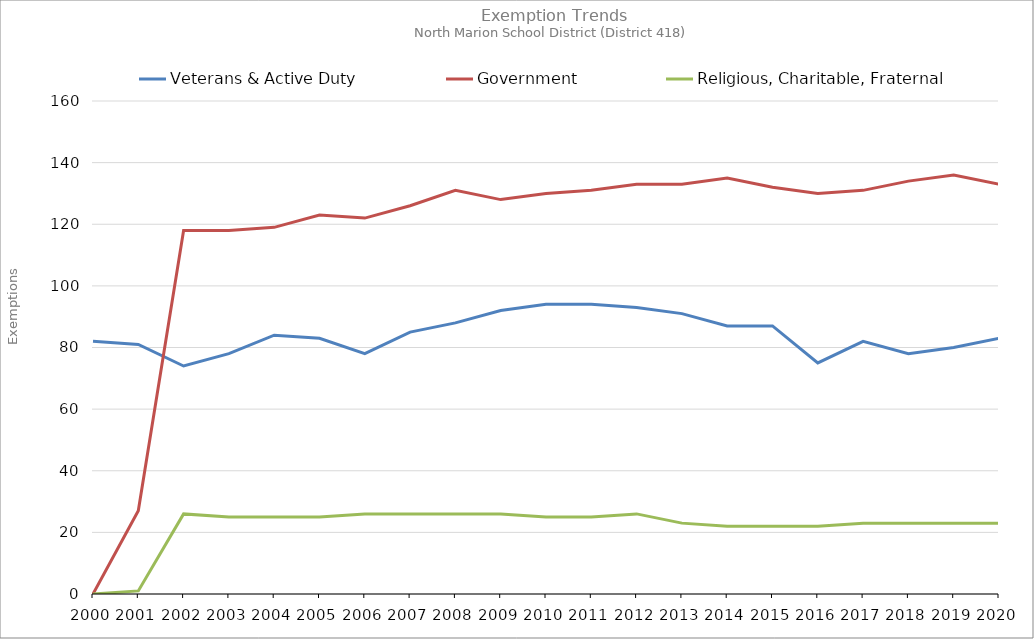
| Category | Veterans & Active Duty | Government | Religious, Charitable, Fraternal |
|---|---|---|---|
| 2000.0 | 82 | 0 | 0 |
| 2001.0 | 81 | 27 | 1 |
| 2002.0 | 74 | 118 | 26 |
| 2003.0 | 78 | 118 | 25 |
| 2004.0 | 84 | 119 | 25 |
| 2005.0 | 83 | 123 | 25 |
| 2006.0 | 78 | 122 | 26 |
| 2007.0 | 85 | 126 | 26 |
| 2008.0 | 88 | 131 | 26 |
| 2009.0 | 92 | 128 | 26 |
| 2010.0 | 94 | 130 | 25 |
| 2011.0 | 94 | 131 | 25 |
| 2012.0 | 93 | 133 | 26 |
| 2013.0 | 91 | 133 | 23 |
| 2014.0 | 87 | 135 | 22 |
| 2015.0 | 87 | 132 | 22 |
| 2016.0 | 75 | 130 | 22 |
| 2017.0 | 82 | 131 | 23 |
| 2018.0 | 78 | 134 | 23 |
| 2019.0 | 80 | 136 | 23 |
| 2020.0 | 83 | 133 | 23 |